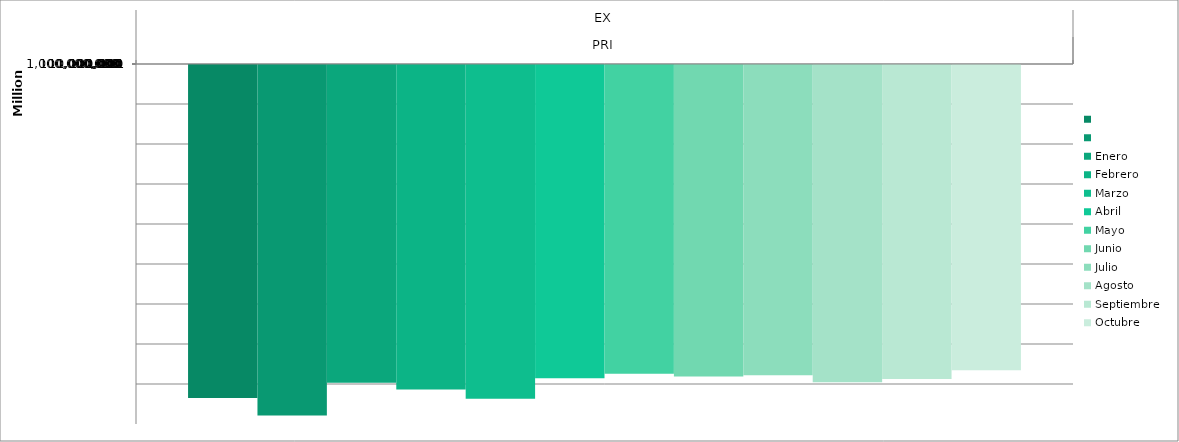
| Category | 2010 | 2011 | 2012 - Enero | 2012 - Febrero | 2012 - Marzo | 2012 - Abril | 2012 - Mayo | 2012 - Junio | 2012 - Julio | 2012 - Agosto | 2012 - Septiembre | 2012 - Octubre |
|---|---|---|---|---|---|---|---|---|---|---|---|---|
| 0 | 212025665.34 | 581957654.89 | 87794857.01 | 130203078.66 | 219136126.57 | 67691650.96 | 52666703.52 | 61624230.85 | 56947551.83 | 85843359.59 | 70822980.62 | 42547727.54 |